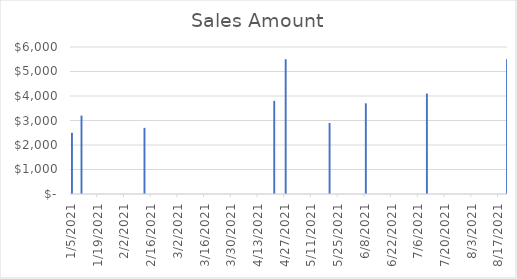
| Category | Sales Amount |
|---|---|
| 1/5/21 | 2500 |
| 1/10/21 | 3200 |
| 2/12/21 | 2700 |
| 4/21/21 | 3800 |
| 4/27/21 | 5500 |
| 5/20/21 | 2900 |
| 6/8/21 | 3700 |
| 7/10/21 | 4100 |
| 8/21/21 | 5500 |